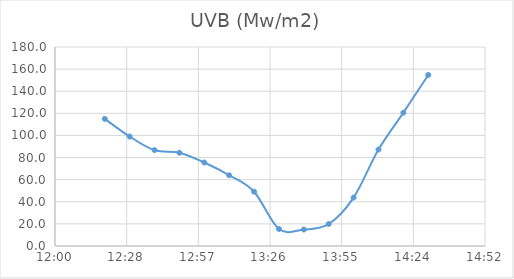
| Category | UVB (Mw/m2) |
|---|---|
| 0.513888888888889 | 115 |
| 0.520833333333333 | 99 |
| 0.527777777777778 | 86.7 |
| 0.534722222222222 | 84.4 |
| 0.541666666666667 | 75.5 |
| 0.548611111111111 | 64 |
| 0.555555555555556 | 49.1 |
| 0.5625 | 15.4 |
| 0.569444444444444 | 14.9 |
| 0.576388888888889 | 19.9 |
| 0.583333333333333 | 43.8 |
| 0.590277777777778 | 87.2 |
| 0.597222222222222 | 120.6 |
| 0.604166666666667 | 154.7 |